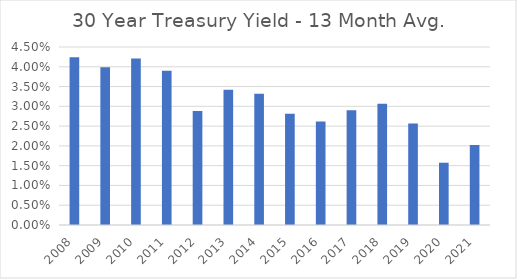
| Category | Series 0 |
|---|---|
| 2008.0 | 0.042 |
| 2009.0 | 0.04 |
| 2010.0 | 0.042 |
| 2011.0 | 0.039 |
| 2012.0 | 0.029 |
| 2013.0 | 0.034 |
| 2014.0 | 0.033 |
| 2015.0 | 0.028 |
| 2016.0 | 0.026 |
| 2017.0 | 0.029 |
| 2018.0 | 0.031 |
| 2019.0 | 0.026 |
| 2020.0 | 0.016 |
| 2021.0 | 0.02 |